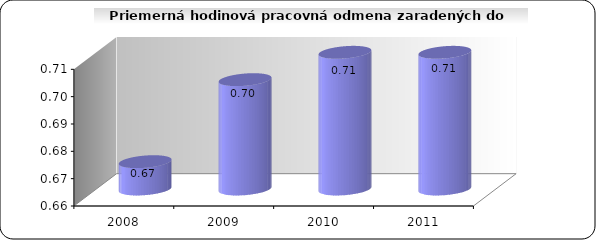
| Category | Priem. hod. zárobok v € |
|---|---|
| 2008.0 | 0.67 |
| 2009.0 | 0.7 |
| 2010.0 | 0.71 |
| 2011.0 | 0.71 |